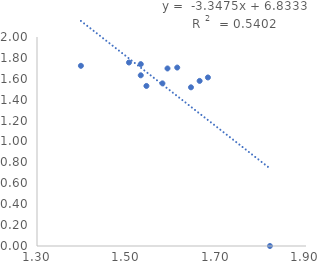
| Category | Series 0 |
|---|---|
| 1.5314789170422551 | 1.633 |
| 1.5314789170422551 | 1.74 |
| 1.5440680443502757 | 1.531 |
| 1.3979400086720377 | 1.724 |
| 1.6434526764861874 | 1.519 |
| 1.5797835966168101 | 1.556 |
| 1.6127838567197355 | 1.708 |
| 1.662757831681574 | 1.58 |
| 1.6812412373755872 | 1.613 |
| 1.591064607026499 | 1.699 |
| 1.505149978319906 | 1.756 |
| 1.8195439355418688 | 0 |